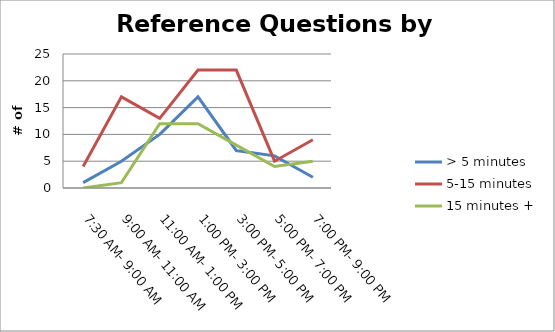
| Category | > 5 minutes | 5-15 minutes | 15 minutes + |
|---|---|---|---|
| 7:30 AM- 9:00 AM | 1 | 4 | 0 |
| 9:00 AM- 11:00 AM | 5 | 17 | 1 |
| 11:00 AM- 1:00 PM | 10 | 13 | 12 |
| 1:00 PM- 3:00 PM | 17 | 22 | 12 |
| 3:00 PM- 5:00 PM | 7 | 22 | 8 |
| 5:00 PM- 7:00 PM | 6 | 5 | 4 |
| 7:00 PM- 9:00 PM | 2 | 9 | 5 |